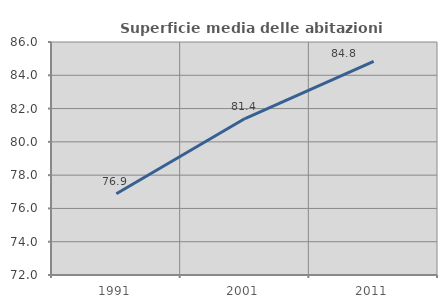
| Category | Superficie media delle abitazioni occupate |
|---|---|
| 1991.0 | 76.886 |
| 2001.0 | 81.402 |
| 2011.0 | 84.841 |